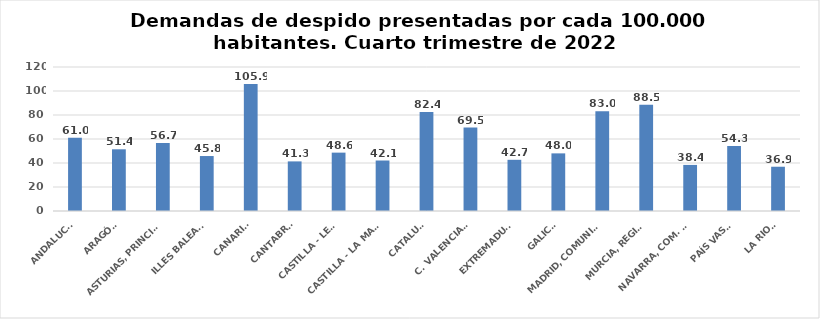
| Category | Series 0 |
|---|---|
| ANDALUCÍA | 61.037 |
| ARAGÓN | 51.421 |
| ASTURIAS, PRINCIPADO | 56.734 |
| ILLES BALEARS | 45.808 |
| CANARIAS | 105.891 |
| CANTABRIA | 41.339 |
| CASTILLA - LEÓN | 48.638 |
| CASTILLA - LA MANCHA | 42.078 |
| CATALUÑA | 82.437 |
| C. VALENCIANA | 69.518 |
| EXTREMADURA | 42.663 |
| GALICIA | 48.021 |
| MADRID, COMUNIDAD | 83.033 |
| MURCIA, REGIÓN | 88.454 |
| NAVARRA, COM. FORAL | 38.397 |
| PAÍS VASCO | 54.253 |
| LA RIOJA | 36.887 |